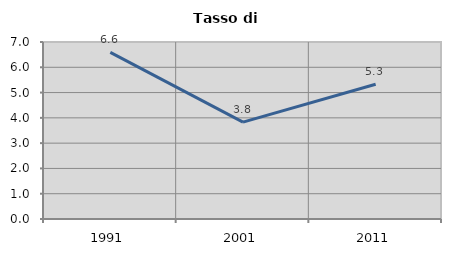
| Category | Tasso di disoccupazione   |
|---|---|
| 1991.0 | 6.587 |
| 2001.0 | 3.833 |
| 2011.0 | 5.331 |